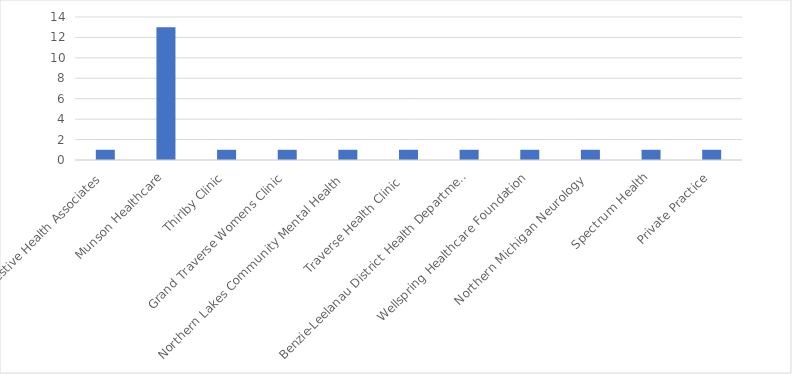
| Category | Number of Responses |
|---|---|
| Digestive Health Associates | 1 |
| Munson Healthcare | 13 |
| Thirlby Clinic | 1 |
| Grand Traverse Womens Clinic | 1 |
| Northern Lakes Community Mental Health  | 1 |
| Traverse Health Clinic  | 1 |
| Benzie-Leelanau District Health Department | 1 |
| Wellspring Healthcare Foundation | 1 |
| Northern Michigan Neurology  | 1 |
| Spectrum Health | 1 |
| Private Practice | 1 |